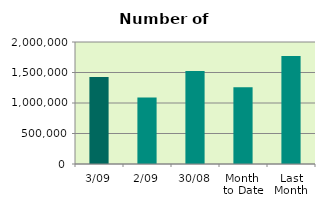
| Category | Series 0 |
|---|---|
| 3/09 | 1425074 |
| 2/09 | 1091134 |
| 30/08 | 1523956 |
| Month 
to Date | 1258104 |
| Last
Month | 1768562.909 |